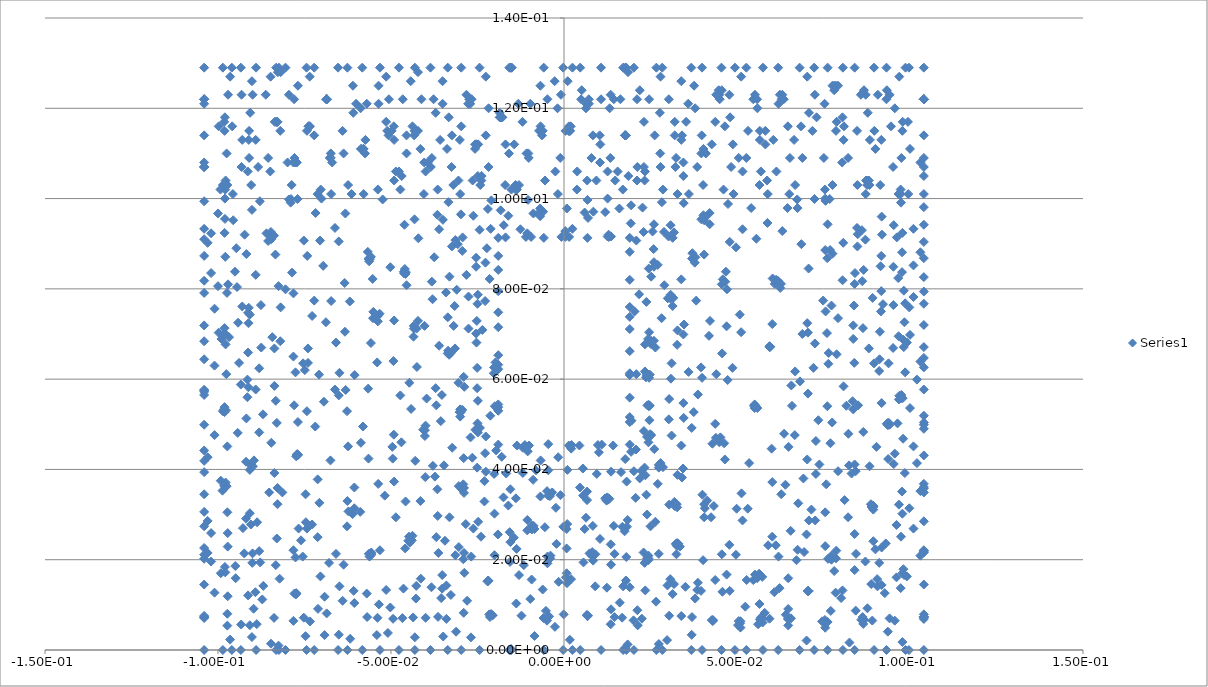
| Category | Series 0 |
|---|---|
| -0.104 | 0.007 |
| -0.0986 | 0 |
| -0.104 | 0 |
| -0.0583 | 0 |
| -0.0541 | 0.003 |
| -0.0532 | 0 |
| -0.0825 | 0.001 |
| -0.0805 | 0 |
| -0.0824 | 0 |
| -0.0832 | 0 |
| -0.104 | 0.008 |
| -0.101 | 0.013 |
| -0.104 | 0.014 |
| -0.0973 | 0.008 |
| -0.104 | 0.007 |
| -0.104 | 0.007 |
| -0.0934 | 0 |
| -0.0965 | 0.002 |
| -0.096 | 0 |
| -0.104 | 0.034 |
| -0.0982 | 0.036 |
| -0.0987 | 0.035 |
| -0.104 | 0.031 |
| -0.0477 | 0 |
| -0.0509 | 0.004 |
| -0.0626 | 0 |
| -0.0618 | 0.002 |
| -0.0569 | 0.007 |
| -0.0744 | 0 |
| -0.0722 | 0 |
| -0.0747 | 0.003 |
| -0.0782 | 0.006 |
| -0.104 | 0.023 |
| -0.104 | 0.027 |
| -0.102 | 0.026 |
| -0.0838 | 0.007 |
| -0.0992 | 0.017 |
| -0.098 | 0.018 |
| -0.102 | 0.02 |
| -0.104 | 0.02 |
| -0.104 | 0.021 |
| -0.103 | 0.029 |
| -0.0979 | 0.036 |
| -0.0979 | 0.036 |
| -0.0973 | 0.03 |
| -0.0653 | 0 |
| -0.0692 | 0.003 |
| -0.0734 | 0.006 |
| -0.0888 | 0.006 |
| -0.0847 | 0.001 |
| -0.0902 | 0.003 |
| -0.089 | 0 |
| -0.0933 | 0.006 |
| -0.0973 | 0.005 |
| -0.0467 | 0.007 |
| -0.0494 | 0.007 |
| -0.0539 | 0.007 |
| -0.0752 | 0.007 |
| -0.0908 | 0.005 |
| -0.0979 | 0.017 |
| -0.0972 | 0.023 |
| -0.0972 | 0.026 |
| -0.103 | 0.022 |
| -0.0711 | 0.009 |
| -0.0686 | 0.008 |
| -0.0651 | 0.003 |
| -0.0975 | 0.036 |
| -0.0913 | 0.012 |
| -0.0892 | 0.013 |
| -0.0897 | 0.009 |
| -0.0949 | 0.016 |
| -0.0872 | 0.011 |
| -0.0972 | 0.012 |
| -0.0535 | 0.01 |
| -0.0502 | 0.009 |
| -0.0514 | 0.013 |
| -0.0919 | 0.029 |
| -0.0928 | 0.027 |
| -0.0908 | 0.04 |
| -0.0908 | 0.03 |
| -0.0692 | 0.012 |
| -0.0869 | 0.014 |
| -0.0901 | 0.019 |
| -0.0878 | 0.019 |
| -0.095 | 0.019 |
| -0.0924 | 0.021 |
| -0.0852 | 0.035 |
| -0.0606 | 0.01 |
| -0.064 | 0.011 |
| -0.0649 | 0.014 |
| -0.0608 | 0.013 |
| -0.0704 | 0.016 |
| -0.0775 | 0.012 |
| -0.0774 | 0.012 |
| -0.0776 | 0.012 |
| -0.0774 | 0.013 |
| -0.0776 | 0.012 |
| -0.0779 | 0.012 |
| -0.0822 | 0.016 |
| -0.0887 | 0.028 |
| -0.0828 | 0.032 |
| -0.083 | 0.025 |
| -0.0881 | 0.022 |
| -0.0559 | 0.021 |
| -0.0557 | 0.021 |
| -0.0562 | 0.021 |
| -0.057 | 0.012 |
| -0.0828 | 0.036 |
| -0.0767 | 0.027 |
| -0.0755 | 0.021 |
| -0.0782 | 0.022 |
| -0.076 | 0.024 |
| -0.0776 | 0.02 |
| -0.0833 | 0.019 |
| -0.09 | 0.021 |
| -0.0905 | 0.028 |
| -0.0459 | 0.022 |
| -0.045 | 0.024 |
| -0.0532 | 0.022 |
| -0.0558 | 0.021 |
| -0.0564 | 0.021 |
| -0.0679 | 0.019 |
| -0.0712 | 0.025 |
| -0.0659 | 0.021 |
| -0.0637 | 0.019 |
| -0.0814 | 0.035 |
| -0.0746 | 0.028 |
| -0.0627 | 0.027 |
| -0.0559 | 0.021 |
| -0.0611 | 0.03 |
| -0.0448 | 0.025 |
| -0.0557 | 0.022 |
| -0.0589 | 0.031 |
| -0.0486 | 0.029 |
| -0.0747 | 0.034 |
| -0.0728 | 0.028 |
| -0.0743 | 0.027 |
| -0.0623 | 0.031 |
| -0.0707 | 0.033 |
| -0.0518 | 0.034 |
| -0.0537 | 0.037 |
| -0.0606 | 0.031 |
| -0.0626 | 0.033 |
| -0.0712 | 0.038 |
| -0.0606 | 0.036 |
| -0.0565 | 0.042 |
| -0.0624 | 0.045 |
| -0.0675 | 0.042 |
| -0.0431 | 0 |
| -0.0431 | 0.003 |
| -0.0491 | 0.037 |
| -0.0349 | 0.003 |
| -0.0336 | 0 |
| -0.0386 | 0 |
| -0.00586 | 0 |
| -0.00492 | 0.006 |
| -0.00262 | 0.005 |
| -0.000234 | 0 |
| -0.0043 | 0.007 |
| -0.0364 | 0.007 |
| -0.034 | 0.007 |
| -0.0269 | 0.003 |
| -0.0297 | 0 |
| -0.0244 | 0 |
| -0.0158 | 0 |
| -0.0155 | 0 |
| -0.0155 | 0 |
| -0.0214 | 0.007 |
| -0.0212 | 0.008 |
| -0.04 | 0.007 |
| 0.00169 | 0.002 |
| 0.00243 | 0 |
| -0.0153 | 0 |
| -0.0206 | 0.008 |
| -0.0152 | 0 |
| -0.00593 | 0.007 |
| -0.00853 | 0.003 |
| -0.0123 | 0.008 |
| -0.0216 | 0.008 |
| -0.029 | 0.008 |
| -0.0312 | 0.004 |
| -0.00523 | 0.009 |
| -0.00975 | 0.011 |
| -0.0464 | 0.014 |
| -0.0428 | 0.011 |
| -0.0427 | 0.014 |
| -0.0138 | 0.01 |
| -0.021 | 0.008 |
| -0.0355 | 0.012 |
| -0.0352 | 0.014 |
| -0.0327 | 0.012 |
| -0.0383 | 0.014 |
| -0.0436 | 0.007 |
| -0.0219 | 0.015 |
| -0.028 | 0.011 |
| -0.0221 | 0.015 |
| -0.0414 | 0.016 |
| 0.00664 | 0.008 |
| 0.000863 | 0.015 |
| -0.0001 | 0.008 |
| 0.00673 | 0.008 |
| 0.00205 | 0.016 |
| -0.00155 | 0.015 |
| -0.00615 | 0.013 |
| -0.00935 | 0.016 |
| -0.013 | 0.017 |
| -0.0116 | 0.019 |
| -0.00489 | 0.035 |
| -0.00456 | 0.034 |
| -0.00406 | 0.034 |
| -0.00341 | 0.035 |
| -0.00102 | 0.034 |
| -0.034 | 0.014 |
| -0.022 | 0.015 |
| -0.022 | 0.015 |
| -0.0212 | 0.008 |
| -0.0288 | 0.017 |
| -0.0291 | 0.02 |
| -0.0219 | 0.015 |
| -0.0268 | 0.021 |
| -0.0156 | 0.02 |
| -0.0139 | 0.034 |
| -0.0106 | 0.029 |
| -0.00681 | 0.034 |
| -0.00929 | 0.028 |
| -0.0088 | 0.028 |
| -0.00478 | 0.021 |
| -0.00391 | 0.021 |
| -0.00853 | 0.027 |
| -0.00925 | 0.027 |
| -0.00479 | 0.019 |
| -0.0201 | 0.021 |
| -0.044 | 0.024 |
| -0.0445 | 0.024 |
| -0.00919 | 0.027 |
| 0.000765 | 0.022 |
| -0.00217 | 0.024 |
| 0.00078 | 0.017 |
| -0.00552 | 0.027 |
| -0.00235 | 0.032 |
| 0.00552 | 0.034 |
| 0.000933 | 0.028 |
| 0.00563 | 0.019 |
| -0.0314 | 0.021 |
| -0.0352 | 0.017 |
| -0.0363 | 0.022 |
| -0.0344 | 0.024 |
| -0.023 | 0.037 |
| -0.023 | 0.033 |
| -0.0175 | 0.034 |
| -0.00021 | 0.027 |
| -0.0137 | 0.022 |
| -0.0155 | 0.024 |
| -0.0106 | 0.026 |
| -0.0145 | 0.025 |
| -0.0289 | 0.036 |
| -0.0438 | 0.025 |
| -0.0369 | 0.025 |
| -0.0289 | 0.035 |
| -0.0248 | 0.028 |
| -0.0295 | 0.036 |
| -0.0294 | 0.036 |
| -0.024 | 0.025 |
| -0.0262 | 0.027 |
| -0.0289 | 0.022 |
| 0.000772 | 0.027 |
| -0.0201 | 0.03 |
| -0.0157 | 0.026 |
| -0.0191 | 0.026 |
| -0.0161 | 0.032 |
| -0.0155 | 0.036 |
| -0.0304 | 0.036 |
| -0.0373 | 0.038 |
| -0.0366 | 0.036 |
| -0.0331 | 0.029 |
| -0.0365 | 0.03 |
| -0.0304 | 0.023 |
| -0.0284 | 0.028 |
| -0.0401 | 0.038 |
| -0.0458 | 0.033 |
| -0.0415 | 0.033 |
| 0.000547 | 0.016 |
| -0.00399 | 0.02 |
| -0.019 | 0.046 |
| -0.018 | 0.043 |
| -0.0136 | 0.045 |
| -0.0113 | 0.045 |
| -0.0101 | 0.045 |
| -0.0105 | 0.044 |
| -0.0119 | 0.039 |
| -0.00808 | 0.04 |
| -0.00675 | 0.042 |
| -0.00455 | 0.046 |
| -0.019 | 0.065 |
| -0.0198 | 0.064 |
| -0.019 | 0.063 |
| -0.02 | 0.054 |
| -0.019 | 0.054 |
| -0.019 | 0.054 |
| -0.019 | 0.062 |
| -0.0203 | 0.061 |
| -0.0249 | 0.055 |
| -0.00453 | 0.04 |
| 0.00209 | 0.045 |
| 0.00221 | 0.045 |
| 0.00139 | 0.045 |
| -0.00168 | 0.043 |
| -0.0167 | 0.039 |
| -0.0119 | 0.045 |
| -0.0202 | 0.063 |
| -0.0251 | 0.058 |
| -0.0251 | 0.062 |
| -0.0226 | 0.047 |
| -0.0213 | 0.052 |
| -0.019 | 0.053 |
| -0.025 | 0.05 |
| -0.0243 | 0.049 |
| -0.0236 | 0.071 |
| -0.0254 | 0.07 |
| -0.0253 | 0.068 |
| -0.019 | 0.072 |
| -0.00892 | 0.038 |
| -0.0196 | 0.044 |
| -0.0249 | 0.048 |
| 0.000984 | 0.04 |
| -0.0294 | 0.053 |
| -0.0202 | 0.039 |
| -0.0226 | 0.04 |
| -0.0298 | 0.053 |
| -0.03 | 0.053 |
| -0.0256 | 0.049 |
| -0.0327 | 0.066 |
| -0.0332 | 0.065 |
| -0.0332 | 0.066 |
| -0.0315 | 0.067 |
| 0.0046 | 0.036 |
| -0.027 | 0.047 |
| -0.03 | 0.052 |
| -0.0323 | 0.045 |
| -0.0336 | 0.066 |
| -0.0335 | 0.066 |
| -0.0361 | 0.067 |
| -0.0302 | 0.053 |
| -0.0353 | 0.056 |
| -0.0369 | 0.054 |
| -0.029 | 0.042 |
| -0.0291 | 0.037 |
| -0.0251 | 0.04 |
| -0.0265 | 0.043 |
| -0.0228 | 0.044 |
| -0.0426 | 0.071 |
| -0.0435 | 0.069 |
| -0.0425 | 0.063 |
| -0.0371 | 0.058 |
| -0.0347 | 0.041 |
| -0.0379 | 0.041 |
| -0.0305 | 0.059 |
| -0.029 | 0.06 |
| -0.0288 | 0.058 |
| -0.0397 | 0.056 |
| -0.0447 | 0.059 |
| -0.0442 | 0.053 |
| -0.0434 | 0.071 |
| -0.0493 | 0.064 |
| -0.0473 | 0.056 |
| -0.054 | 0.064 |
| -0.047 | 0.046 |
| -0.0492 | 0.048 |
| -0.043 | 0.042 |
| -0.0495 | 0.042 |
| -0.0496 | 0.045 |
| -0.0587 | 0.046 |
| -0.0581 | 0.05 |
| -0.0566 | 0.058 |
| -0.0491 | 0.073 |
| -0.0538 | 0.073 |
| -0.0402 | 0.049 |
| -0.04 | 0.05 |
| -0.0407 | 0.049 |
| -0.0402 | 0.047 |
| -0.0356 | 0.051 |
| -0.104 | 0.05 |
| -0.101 | 0.048 |
| -0.104 | 0.044 |
| -0.104 | 0.042 |
| -0.0992 | 0.038 |
| -0.104 | 0.039 |
| -0.0978 | 0.037 |
| -0.104 | 0.057 |
| -0.104 | 0.056 |
| -0.0986 | 0.053 |
| -0.0983 | 0.053 |
| -0.0981 | 0.053 |
| -0.0973 | 0.045 |
| -0.103 | 0.043 |
| -0.099 | 0.069 |
| -0.0998 | 0.07 |
| -0.104 | 0.068 |
| -0.104 | 0.064 |
| -0.098 | 0.07 |
| -0.0981 | 0.053 |
| -0.104 | 0.058 |
| -0.0976 | 0.061 |
| -0.0981 | 0.054 |
| -0.0978 | 0.068 |
| -0.101 | 0.063 |
| -0.104 | 0.058 |
| -0.0919 | 0.042 |
| -0.0939 | 0.064 |
| -0.0977 | 0.053 |
| -0.0943 | 0.048 |
| -0.0907 | 0.041 |
| -0.0915 | 0.056 |
| -0.0934 | 0.059 |
| -0.0912 | 0.058 |
| -0.0918 | 0.051 |
| -0.0875 | 0.067 |
| -0.0843 | 0.069 |
| -0.0837 | 0.067 |
| -0.0915 | 0.06 |
| -0.0913 | 0.066 |
| -0.0968 | 0.069 |
| -0.0891 | 0.058 |
| -0.0837 | 0.058 |
| -0.0881 | 0.062 |
| -0.0899 | 0.041 |
| -0.0896 | 0.042 |
| -0.0837 | 0.039 |
| -0.0846 | 0.046 |
| -0.0881 | 0.048 |
| -0.0782 | 0.065 |
| -0.074 | 0.067 |
| -0.0728 | 0.074 |
| -0.082 | 0.068 |
| -0.0754 | 0.064 |
| -0.0776 | 0.062 |
| -0.078 | 0.054 |
| -0.0749 | 0.062 |
| -0.0743 | 0.053 |
| -0.0769 | 0.05 |
| -0.0833 | 0.055 |
| -0.083 | 0.05 |
| -0.087 | 0.052 |
| -0.074 | 0.064 |
| -0.0774 | 0.043 |
| -0.0772 | 0.043 |
| -0.077 | 0.043 |
| -0.0771 | 0.043 |
| -0.0771 | 0.043 |
| -0.0688 | 0.073 |
| -0.0659 | 0.068 |
| -0.0769 | 0.043 |
| -0.0719 | 0.05 |
| -0.0708 | 0.061 |
| -0.0694 | 0.055 |
| -0.0649 | 0.061 |
| -0.0662 | 0.058 |
| -0.0605 | 0.061 |
| -0.0558 | 0.068 |
| -0.0633 | 0.07 |
| -0.0651 | 0.056 |
| -0.0627 | 0.053 |
| -0.0631 | 0.058 |
| 0.0124 | 0.014 |
| 0.00902 | 0.014 |
| 0.00842 | 0.02 |
| 0.0136 | 0.019 |
| 0.00906 | 0.021 |
| 0.0146 | 0.021 |
| 0.0171 | 0.014 |
| 0.0179 | 0.015 |
| 0.019 | 0.014 |
| 0.00682 | 0.008 |
| 0.0136 | 0.009 |
| 0.0161 | 0.01 |
| 0.0325 | 0.021 |
| 0.0326 | 0.023 |
| 0.0274 | 0.021 |
| 0.008 | 0.021 |
| 0.00738 | 0.021 |
| 0.0244 | 0.02 |
| 0.0244 | 0.02 |
| 0.024 | 0.02 |
| 0.0233 | 0.019 |
| 0.018 | 0.021 |
| 0.0307 | 0.016 |
| 0.0299 | 0.014 |
| 0.0318 | 0.015 |
| 0.00677 | 0.008 |
| 0.00679 | 0.008 |
| 0.0235 | 0.013 |
| 0.0146 | 0.007 |
| 0.0168 | 0.007 |
| 0.0212 | 0.009 |
| 0.0314 | 0.012 |
| 0.0225 | 0.007 |
| 0.0266 | 0.011 |
| 0.0201 | 0.007 |
| 0.0304 | 0.008 |
| 0.00683 | 0.008 |
| 0.0184 | 0.001 |
| 0.0213 | 0.005 |
| 0.0171 | 0 |
| 0.0135 | 0.006 |
| 0.0177 | 0 |
| 0.018 | 0 |
| 0.00681 | 0.008 |
| 0.00469 | 0 |
| 0.0107 | 0 |
| 0.0284 | 0 |
| 0.0267 | 0 |
| 0.0274 | 0.001 |
| 0.0202 | 0 |
| 0.0524 | 0.01 |
| 0.0547 | 0.016 |
| 0.0565 | 0.01 |
| 0.0558 | 0.016 |
| 0.0528 | 0.016 |
| 0.0552 | 0.017 |
| 0.0399 | 0 |
| 0.043 | 0.006 |
| 0.0427 | 0.007 |
| 0.0369 | 0.003 |
| 0.0368 | 0 |
| 0.043 | 0.007 |
| 0.0335 | 0.023 |
| 0.0479 | 0.013 |
| 0.047 | 0.017 |
| 0.0458 | 0.013 |
| 0.0456 | 0.021 |
| 0.0497 | 0.021 |
| 0.0437 | 0.016 |
| 0.0402 | 0.02 |
| 0.0351 | 0.014 |
| 0.0387 | 0.015 |
| 0.0396 | 0.013 |
| 0.0385 | 0.013 |
| 0.0569 | 0.007 |
| 0.051 | 0.006 |
| 0.0379 | 0.011 |
| 0.0339 | 0.008 |
| 0.0509 | 0.006 |
| 0.0505 | 0.006 |
| 0.0566 | 0.007 |
| 0.0573 | 0.007 |
| 0.037 | 0.007 |
| 0.0431 | 0.007 |
| 0.0298 | 0.002 |
| 0.0574 | 0.006 |
| 0.0561 | 0.006 |
| 0.051 | 0.005 |
| 0.0527 | 0 |
| 0.0575 | 0 |
| 0.0503 | 0.006 |
| 0.0455 | 0 |
| 0.0494 | 0 |
| 0.0328 | 0.039 |
| 0.0271 | 0.037 |
| 0.0319 | 0.033 |
| 0.032 | 0.032 |
| 0.0304 | 0.032 |
| 0.0238 | 0.034 |
| 0.0323 | 0.024 |
| 0.025 | 0.027 |
| 0.0244 | 0.021 |
| 0.0465 | 0.042 |
| 0.0513 | 0.035 |
| 0.0535 | 0.041 |
| 0.0463 | 0.046 |
| 0.0449 | 0.046 |
| 0.0602 | 0.037 |
| 0.0602 | 0.025 |
| 0.0531 | 0.031 |
| 0.0628 | 0.034 |
| 0.04 | 0.034 |
| 0.0414 | 0.033 |
| 0.0405 | 0.032 |
| 0.0429 | 0.046 |
| 0.0341 | 0.038 |
| 0.0344 | 0.04 |
| 0.0331 | 0.024 |
| 0.0407 | 0.031 |
| 0.0405 | 0.029 |
| 0.0425 | 0.029 |
| 0.0433 | 0.032 |
| 0.0478 | 0.023 |
| 0.0499 | 0.031 |
| 0.0326 | 0.032 |
| 0.0327 | 0.032 |
| 0.0264 | 0.028 |
| 0.024 | 0.03 |
| 0.0327 | 0.024 |
| 0.059 | 0.023 |
| 0.0516 | 0.029 |
| 0.0207 | 0.034 |
| 0.00833 | 0.028 |
| 0.0104 | 0.025 |
| 0.0144 | 0.028 |
| 0.0135 | 0.023 |
| 0.0169 | 0.027 |
| 0.00597 | 0.027 |
| 0.00636 | 0.029 |
| 0.00668 | 0.033 |
| 0.00816 | 0.022 |
| 0.0123 | 0.033 |
| 0.0127 | 0.033 |
| 0.0119 | 0.034 |
| 0.0127 | 0.034 |
| 0.023 | 0.022 |
| 0.0182 | 0.027 |
| 0.0184 | 0.029 |
| 0.0175 | 0.026 |
| 0.0131 | 0.034 |
| 0.0786 | 0.02 |
| 0.0773 | 0.02 |
| 0.0773 | 0.021 |
| 0.0763 | 0.02 |
| 0.0781 | 0.018 |
| 0.0706 | 0.013 |
| 0.0706 | 0.013 |
| 0.0706 | 0.013 |
| 0.0754 | 0.006 |
| 0.0754 | 0.007 |
| 0.0746 | 0.006 |
| 0.0762 | 0.006 |
| 0.0706 | 0.013 |
| 0.0706 | 0.013 |
| 0.0648 | 0.016 |
| 0.0672 | 0.02 |
| 0.062 | 0.021 |
| 0.0612 | 0.023 |
| 0.0675 | 0.022 |
| 0.0694 | 0.022 |
| 0.0647 | 0.007 |
| 0.0648 | 0.009 |
| 0.0641 | 0.008 |
| 0.0656 | 0.007 |
| 0.0623 | 0.014 |
| 0.0706 | 0.013 |
| 0.0706 | 0.013 |
| 0.0608 | 0.013 |
| 0.0573 | 0.016 |
| 0.0564 | 0.017 |
| 0.084 | 0.018 |
| 0.0844 | 0.021 |
| 0.0805 | 0.013 |
| 0.0785 | 0.013 |
| 0.0801 | 0.012 |
| 0.0771 | 0.009 |
| 0.0706 | 0.013 |
| 0.058 | 0.008 |
| 0.0594 | 0.007 |
| 0.0843 | 0.009 |
| 0.0859 | 0.007 |
| 0.0755 | 0.005 |
| 0.0648 | 0.005 |
| 0.0619 | 0 |
| 0.084 | 0 |
| 0.0825 | 0.002 |
| 0.0806 | 0 |
| 0.0681 | 0 |
| 0.0701 | 0.002 |
| 0.0762 | 0 |
| 0.0723 | 0 |
| 0.0891 | 0.007 |
| 0.0877 | 0.009 |
| 0.0868 | 0.007 |
| 0.0863 | 0.007 |
| 0.0936 | 0.004 |
| 0.0941 | 0.007 |
| 0.0956 | 0.006 |
| 0.0871 | 0.02 |
| 0.0961 | 0.016 |
| 0.0911 | 0.019 |
| 0.0918 | 0.023 |
| 0.0978 | 0.017 |
| 0.0983 | 0.017 |
| 0.09 | 0.022 |
| 0.0905 | 0.016 |
| 0.0888 | 0.015 |
| 0.0906 | 0.014 |
| 0.0918 | 0.014 |
| 0.0973 | 0.014 |
| 0.0927 | 0.013 |
| 0.104 | 0.007 |
| 0.104 | 0.007 |
| 0.104 | 0.008 |
| 0.104 | 0.007 |
| 0.104 | 0.007 |
| 0.104 | 0.007 |
| 0.0978 | 0.002 |
| 0.0865 | 0.006 |
| 0.0896 | 0 |
| 0.0991 | 0.016 |
| 0.104 | 0.014 |
| 0.103 | 0.021 |
| 0.104 | 0.022 |
| 0.104 | 0.022 |
| 0.0997 | 0 |
| 0.0987 | 0 |
| 0.0932 | 0 |
| 0.104 | 0 |
| 0.0811 | 0.033 |
| 0.0821 | 0.029 |
| 0.0755 | 0.03 |
| 0.0977 | 0.035 |
| 0.0968 | 0.032 |
| 0.0893 | 0.032 |
| 0.0894 | 0.032 |
| 0.0953 | 0.041 |
| 0.0892 | 0.032 |
| 0.0893 | 0.032 |
| 0.0758 | 0.037 |
| 0.0831 | 0.039 |
| 0.0792 | 0.04 |
| 0.0728 | 0.039 |
| 0.0715 | 0.031 |
| 0.0894 | 0.024 |
| 0.0894 | 0.031 |
| 0.0787 | 0.022 |
| 0.084 | 0.026 |
| 0.0755 | 0.023 |
| 0.0891 | 0.032 |
| 0.0889 | 0.032 |
| 0.0726 | 0.029 |
| 0.0887 | 0.032 |
| 0.0843 | 0.04 |
| 0.0892 | 0.032 |
| 0.0937 | 0.042 |
| 0.0883 | 0.041 |
| 0.093 | 0.024 |
| 0.0981 | 0.018 |
| 0.0961 | 0.028 |
| 0.0974 | 0.025 |
| 0.103 | 0.035 |
| 0.0998 | 0.031 |
| 0.0978 | 0.03 |
| 0.104 | 0.022 |
| 0.101 | 0.027 |
| 0.104 | 0.022 |
| 0.104 | 0.028 |
| 0.104 | 0.035 |
| 0.104 | 0.036 |
| 0.064 | 0.037 |
| 0.0677 | 0.032 |
| 0.0692 | 0.038 |
| 0.0655 | 0.026 |
| 0.0701 | 0.026 |
| 0.0708 | 0.029 |
| 0.0667 | 0.048 |
| 0.0649 | 0.045 |
| 0.0703 | 0.042 |
| 0.06 | 0.045 |
| 0.0636 | 0.048 |
| 0.0659 | 0.054 |
| 0.0559 | 0.054 |
| 0.0738 | 0.041 |
| 0.0549 | 0.054 |
| 0.0551 | 0.054 |
| 0.0553 | 0.054 |
| 0.0452 | 0.047 |
| 0.0735 | 0.051 |
| 0.0728 | 0.046 |
| 0.0705 | 0.057 |
| 0.0682 | 0.06 |
| 0.0657 | 0.059 |
| 0.0824 | 0.041 |
| 0.077 | 0.046 |
| 0.0775 | 0.05 |
| 0.0761 | 0.054 |
| 0.0822 | 0.048 |
| 0.0473 | 0.06 |
| 0.0816 | 0.054 |
| 0.0836 | 0.053 |
| 0.0964 | 0.05 |
| 0.0941 | 0.05 |
| 0.0939 | 0.05 |
| 0.104 | 0.05 |
| 0.1 | 0.054 |
| 0.098 | 0.047 |
| 0.0865 | 0.048 |
| 0.0933 | 0.05 |
| 0.0936 | 0.05 |
| 0.0936 | 0.05 |
| 0.0903 | 0.045 |
| 0.0956 | 0.044 |
| 0.0985 | 0.039 |
| 0.104 | 0.036 |
| 0.102 | 0.041 |
| 0.104 | 0.037 |
| 0.101 | 0.045 |
| 0.104 | 0.043 |
| 0.084 | 0.041 |
| 0.104 | 0.05 |
| 0.104 | 0.049 |
| 0.0973 | 0.056 |
| 0.085 | 0.054 |
| 0.0918 | 0.055 |
| 0.0968 | 0.056 |
| 0.0969 | 0.056 |
| 0.0975 | 0.056 |
| 0.0788 | 0.066 |
| 0.0765 | 0.066 |
| 0.0764 | 0.063 |
| 0.0808 | 0.058 |
| 0.0834 | 0.055 |
| 0.0839 | 0.064 |
| 0.0836 | 0.069 |
| 0.0864 | 0.071 |
| 0.0881 | 0.067 |
| 0.0913 | 0.07 |
| 0.0916 | 0.075 |
| 0.0912 | 0.064 |
| 0.0896 | 0.064 |
| 0.0911 | 0.062 |
| 0.0938 | 0.064 |
| 0.0986 | 0.062 |
| 0.0981 | 0.069 |
| 0.0951 | 0.067 |
| 0.0982 | 0.067 |
| 0.0967 | 0.07 |
| 0.104 | 0.052 |
| 0.0979 | 0.056 |
| 0.104 | 0.058 |
| 0.102 | 0.06 |
| 0.104 | 0.063 |
| 0.103 | 0.064 |
| 0.0991 | 0.068 |
| 0.104 | 0.065 |
| 0.0668 | 0.062 |
| 0.0595 | 0.067 |
| 0.0596 | 0.067 |
| 0.0594 | 0.067 |
| 0.0487 | 0.062 |
| 0.0512 | 0.07 |
| 0.0551 | 0.054 |
| 0.0689 | 0.07 |
| 0.0725 | 0.068 |
| 0.0721 | 0.062 |
| 0.044 | 0.061 |
| 0.0457 | 0.066 |
| 0.047 | 0.072 |
| 0.0248 | 0.047 |
| 0.0261 | 0.044 |
| 0.0244 | 0.046 |
| 0.0252 | 0.048 |
| 0.0274 | 0.04 |
| 0.0235 | 0.039 |
| 0.0274 | 0.041 |
| 0.0233 | 0.04 |
| 0.0279 | 0.041 |
| 0.0311 | 0.048 |
| 0.0286 | 0.04 |
| 0.00446 | 0.045 |
| 0.0101 | 0.044 |
| 0.00546 | 0.04 |
| 0.00947 | 0.039 |
| 0.0231 | 0.048 |
| 0.0247 | 0.051 |
| 0.0249 | 0.048 |
| 0.0208 | 0.044 |
| 0.019 | 0.046 |
| 0.0194 | 0.044 |
| 0.024 | 0.047 |
| 0.0224 | 0.04 |
| 0.0219 | 0.038 |
| 0.0181 | 0.037 |
| 0.0202 | 0.04 |
| 0.0165 | 0.039 |
| 0.0128 | 0.034 |
| 0.0303 | 0.051 |
| 0.00668 | 0.035 |
| 0.0125 | 0.034 |
| 0.0136 | 0.04 |
| 0.0177 | 0.042 |
| 0.0248 | 0.054 |
| 0.0245 | 0.054 |
| 0.019 | 0.05 |
| 0.019 | 0.052 |
| 0.0195 | 0.051 |
| 0.0142 | 0.045 |
| 0.0109 | 0.046 |
| 0.0098 | 0.045 |
| 0.0339 | 0.045 |
| 0.0439 | 0.047 |
| 0.0437 | 0.05 |
| 0.0387 | 0.057 |
| 0.0375 | 0.053 |
| 0.0369 | 0.049 |
| 0.0346 | 0.051 |
| 0.036 | 0.062 |
| 0.0399 | 0.06 |
| 0.0396 | 0.063 |
| 0.0419 | 0.07 |
| 0.0345 | 0.07 |
| 0.0327 | 0.068 |
| 0.0328 | 0.071 |
| 0.0345 | 0.055 |
| 0.0304 | 0.056 |
| 0.0309 | 0.06 |
| 0.0264 | 0.067 |
| 0.026 | 0.068 |
| 0.0311 | 0.064 |
| 0.0248 | 0.061 |
| 0.0251 | 0.068 |
| 0.0242 | 0.061 |
| 0.0242 | 0.061 |
| 0.0246 | 0.06 |
| 0.0245 | 0.054 |
| 0.019 | 0.061 |
| 0.019 | 0.061 |
| 0.0209 | 0.061 |
| 0.019 | 0.056 |
| 0.0237 | 0.06 |
| 0.0241 | 0.054 |
| 0.0239 | 0.061 |
| 0.019 | 0.066 |
| 0.0234 | 0.062 |
| 0.0234 | 0.068 |
| 0.0252 | 0.068 |
| 0.0282 | 0.074 |
| 0.0246 | 0.07 |
| 0.0314 | 0.076 |
| 0.026 | 0.085 |
| 0.029 | 0.081 |
| 0.0271 | 0.085 |
| 0.03 | 0.078 |
| 0.0307 | 0.078 |
| 0.0308 | 0.079 |
| 0.0238 | 0.077 |
| 0.0252 | 0.083 |
| 0.0204 | 0.075 |
| 0.0217 | 0.079 |
| 0.019 | 0.076 |
| 0.019 | 0.082 |
| 0.0243 | 0.069 |
| 0.019 | 0.074 |
| 0.0245 | 0.084 |
| 0.019 | 0.071 |
| 0.0471 | 0.08 |
| 0.0466 | 0.082 |
| 0.0614 | 0.082 |
| 0.0609 | 0.081 |
| 0.0339 | 0.082 |
| 0.037 | 0.087 |
| 0.0602 | 0.072 |
| 0.0617 | 0.081 |
| 0.0616 | 0.082 |
| 0.0508 | 0.074 |
| 0.0594 | 0.067 |
| 0.0456 | 0.081 |
| 0.0459 | 0.082 |
| 0.0422 | 0.073 |
| 0.0382 | 0.077 |
| 0.0378 | 0.086 |
| 0.038 | 0.087 |
| 0.0347 | 0.072 |
| 0.0316 | 0.078 |
| 0.0209 | 0.091 |
| 0.026 | 0.086 |
| 0.019 | 0.088 |
| 0.0516 | 0.093 |
| 0.0479 | 0.09 |
| 0.0497 | 0.089 |
| 0.0556 | 0.091 |
| 0.0588 | 0.095 |
| 0.0541 | 0.098 |
| 0.0565 | 0.103 |
| 0.049 | 0.101 |
| 0.0289 | 0.093 |
| 0.0302 | 0.092 |
| 0.0318 | 0.092 |
| 0.0314 | 0.091 |
| 0.0259 | 0.089 |
| 0.023 | 0.093 |
| 0.0603 | 0.082 |
| 0.0468 | 0.084 |
| 0.0405 | 0.095 |
| 0.0421 | 0.094 |
| 0.0407 | 0.096 |
| 0.0421 | 0.097 |
| 0.0403 | 0.096 |
| 0.0397 | 0.095 |
| 0.0193 | 0.094 |
| 0.026 | 0.094 |
| 0.0227 | 0.098 |
| 0.0194 | 0.098 |
| 0.0613 | 0.082 |
| 0.0474 | 0.099 |
| 0.0405 | 0.088 |
| 0.0346 | 0.099 |
| 0.0371 | 0.088 |
| 0.0361 | 0.101 |
| 0.0461 | 0.102 |
| 0.0402 | 0.103 |
| 0.0328 | 0.101 |
| 0.0308 | 0.094 |
| 0.0283 | 0.099 |
| 0.0256 | 0.093 |
| 0.019 | 0.091 |
| -0.0069 | 0.098 |
| -0.00688 | 0.097 |
| -0.00604 | 0.097 |
| 0.016 | 0.098 |
| 0.0126 | 0.1 |
| 0.0119 | 0.097 |
| 0.00848 | 0.097 |
| 0.00694 | 0.096 |
| 0.00243 | 0.093 |
| 0.00596 | 0.097 |
| 0.00677 | 0.091 |
| 0.00148 | 0.092 |
| 0.000379 | 0.093 |
| 0.000827 | 0.098 |
| 0.0129 | 0.092 |
| 0.0126 | 0.092 |
| 0.000375 | 0.092 |
| -0.00075 | 0.092 |
| -0.00689 | 0.096 |
| 0.0136 | 0.092 |
| -0.00583 | 0.091 |
| 0.0129 | 0.092 |
| 0.0618 | 0.082 |
| 0.0627 | 0.081 |
| 0.0625 | 0.08 |
| 0.0756 | 0.075 |
| 0.0705 | 0.07 |
| 0.0703 | 0.072 |
| 0.0749 | 0.077 |
| 0.076 | 0.07 |
| 0.0707 | 0.084 |
| 0.084 | 0.081 |
| 0.0841 | 0.084 |
| 0.0805 | 0.082 |
| 0.0773 | 0.076 |
| 0.0761 | 0.087 |
| 0.0792 | 0.074 |
| 0.0836 | 0.072 |
| 0.0838 | 0.076 |
| 0.0966 | 0.082 |
| 0.0922 | 0.077 |
| 0.0917 | 0.08 |
| 0.0952 | 0.085 |
| 0.0977 | 0.084 |
| 0.0892 | 0.078 |
| 0.0952 | 0.076 |
| 0.0982 | 0.08 |
| 0.0915 | 0.085 |
| 0.0917 | 0.087 |
| 0.0862 | 0.082 |
| 0.0866 | 0.084 |
| 0.0986 | 0.077 |
| 0.0984 | 0.073 |
| 0.1 | 0.07 |
| 0.101 | 0.085 |
| 0.104 | 0.083 |
| 0.101 | 0.078 |
| 0.104 | 0.079 |
| 0.0998 | 0.076 |
| 0.104 | 0.072 |
| 0.104 | 0.077 |
| 0.104 | 0.067 |
| 0.104 | 0.087 |
| 0.0807 | 0.09 |
| 0.0769 | 0.089 |
| 0.0776 | 0.088 |
| 0.0762 | 0.094 |
| 0.0872 | 0.101 |
| 0.0848 | 0.103 |
| 0.0876 | 0.103 |
| 0.0768 | 0.1 |
| 0.0847 | 0.094 |
| 0.0861 | 0.093 |
| 0.0883 | 0.103 |
| 0.0918 | 0.096 |
| 0.0849 | 0.092 |
| 0.0848 | 0.089 |
| 0.0756 | 0.1 |
| 0.0755 | 0.1 |
| 0.0871 | 0.091 |
| 0.0968 | 0.101 |
| 0.0914 | 0.103 |
| 0.0967 | 0.101 |
| 0.0881 | 0.104 |
| 0.0919 | 0.092 |
| 0.0978 | 0.092 |
| 0.0974 | 0.099 |
| 0.0953 | 0.094 |
| 0.0962 | 0.091 |
| 0.0973 | 0.101 |
| 0.0977 | 0.088 |
| 0.0995 | 0.101 |
| 0.104 | 0.09 |
| 0.104 | 0.094 |
| 0.101 | 0.093 |
| 0.104 | 0.098 |
| 0.103 | 0.088 |
| 0.104 | 0.101 |
| 0.0651 | 0.101 |
| 0.0674 | 0.1 |
| 0.0646 | 0.098 |
| 0.0587 | 0.104 |
| 0.0589 | 0.101 |
| 0.0755 | 0.089 |
| 0.0675 | 0.098 |
| 0.0631 | 0.093 |
| 0.0686 | 0.09 |
| 0.0724 | 0.1 |
| 0.0718 | 0.115 |
| 0.0689 | 0.109 |
| 0.0751 | 0.109 |
| 0.0605 | 0.113 |
| 0.0653 | 0.109 |
| 0.0665 | 0.113 |
| 0.0614 | 0.106 |
| 0.0582 | 0.112 |
| 0.0566 | 0.113 |
| 0.0569 | 0.106 |
| 0.0668 | 0.103 |
| 0.0582 | 0.115 |
| 0.0516 | 0.106 |
| 0.0527 | 0.109 |
| 0.0483 | 0.107 |
| 0.0505 | 0.109 |
| 0.0873 | 0.104 |
| 0.0804 | 0.108 |
| 0.0776 | 0.103 |
| 0.0786 | 0.115 |
| 0.0808 | 0.113 |
| 0.0809 | 0.116 |
| 0.0788 | 0.117 |
| 0.0754 | 0.102 |
| 0.0877 | 0.104 |
| 0.0821 | 0.109 |
| 0.0532 | 0.115 |
| 0.0488 | 0.112 |
| 0.0465 | 0.116 |
| 0.073 | 0.118 |
| 0.0685 | 0.116 |
| 0.0566 | 0.115 |
| 0.0647 | 0.116 |
| 0.09 | 0.111 |
| 0.0884 | 0.113 |
| 0.0897 | 0.115 |
| 0.0973 | 0.102 |
| 0.0951 | 0.107 |
| 0.0847 | 0.115 |
| 0.0917 | 0.113 |
| 0.0975 | 0.109 |
| 0.0945 | 0.116 |
| 0.0978 | 0.115 |
| 0.0979 | 0.117 |
| 0.0994 | 0.117 |
| 0.104 | 0.105 |
| 0.103 | 0.108 |
| 0.104 | 0.107 |
| 0.1 | 0.111 |
| 0.104 | 0.114 |
| 0.104 | 0.109 |
| 0.0786 | 0.125 |
| 0.0776 | 0.125 |
| 0.0781 | 0.124 |
| 0.0781 | 0.125 |
| 0.0858 | 0.123 |
| 0.0805 | 0.118 |
| 0.0725 | 0.123 |
| 0.0753 | 0.121 |
| 0.0933 | 0.124 |
| 0.0907 | 0.123 |
| 0.0941 | 0.123 |
| 0.104 | 0.122 |
| 0.104 | 0.122 |
| 0.0956 | 0.12 |
| 0.0969 | 0.127 |
| 0.104 | 0.122 |
| 0.0878 | 0.119 |
| 0.0932 | 0.122 |
| 0.0872 | 0.123 |
| 0.104 | 0.122 |
| 0.104 | 0.122 |
| 0.0723 | 0.129 |
| 0.0703 | 0.127 |
| 0.0762 | 0.129 |
| 0.0792 | 0.125 |
| 0.0806 | 0.129 |
| 0.084 | 0.129 |
| 0.0867 | 0.124 |
| 0.0987 | 0.129 |
| 0.0896 | 0.129 |
| 0.0932 | 0.129 |
| 0.104 | 0.122 |
| 0.104 | 0.129 |
| 0.0997 | 0.129 |
| 0.0708 | 0.119 |
| 0.0635 | 0.122 |
| 0.0634 | 0.122 |
| 0.0629 | 0.122 |
| 0.062 | 0.121 |
| 0.048 | 0.118 |
| 0.0547 | 0.122 |
| 0.0559 | 0.12 |
| 0.0558 | 0.122 |
| 0.0575 | 0.129 |
| 0.0624 | 0.123 |
| 0.0552 | 0.123 |
| 0.0631 | 0.123 |
| 0.0619 | 0.129 |
| 0.0681 | 0.129 |
| 0.045 | 0.122 |
| 0.0478 | 0.123 |
| 0.0449 | 0.123 |
| 0.0527 | 0.129 |
| 0.0512 | 0.127 |
| 0.0494 | 0.129 |
| 0.0456 | 0.124 |
| 0.017 | 0.102 |
| 0.0148 | 0.104 |
| 0.0211 | 0.104 |
| 0.0234 | 0.106 |
| 0.0212 | 0.107 |
| 0.0178 | 0.114 |
| 0.0177 | 0.114 |
| 0.0155 | 0.106 |
| 0.0186 | 0.105 |
| 0.00835 | 0.114 |
| 0.00793 | 0.109 |
| 0.00178 | 0.115 |
| 0.0105 | 0.112 |
| 0.00145 | 0.115 |
| 0.00382 | 0.106 |
| -0.00107 | 0.109 |
| 0.0262 | 0.114 |
| 0.0278 | 0.11 |
| 0.032 | 0.114 |
| 0.0231 | 0.107 |
| 0.0279 | 0.107 |
| 0.0286 | 0.102 |
| 0.0134 | 0.109 |
| 0.00936 | 0.104 |
| 0.0126 | 0.106 |
| 0.00151 | 0.115 |
| 0.0014 | 0.115 |
| 0.000439 | 0.115 |
| -0.00251 | 0.106 |
| -0.00627 | 0.115 |
| -0.00616 | 0.115 |
| 0.0233 | 0.104 |
| 0.0067 | 0.104 |
| 0.0104 | 0.108 |
| 0.0103 | 0.114 |
| 0.0176 | 0.114 |
| -0.00176 | 0.101 |
| -0.00549 | 0.104 |
| 0.00374 | 0.102 |
| 0.0178 | 0.114 |
| 0.00679 | 0.1 |
| 0.0177 | 0.114 |
| 0.0322 | 0.107 |
| 0.0345 | 0.105 |
| 0.0324 | 0.109 |
| 0.0345 | 0.108 |
| 0.0397 | 0.11 |
| 0.0339 | 0.113 |
| 0.0385 | 0.107 |
| 0.0427 | 0.112 |
| 0.041 | 0.11 |
| 0.0403 | 0.111 |
| 0.0341 | 0.114 |
| 0.0353 | 0.117 |
| 0.0398 | 0.114 |
| 0.0379 | 0.12 |
| 0.0437 | 0.117 |
| 0.0359 | 0.121 |
| 0.0303 | 0.122 |
| 0.032 | 0.117 |
| 0.0277 | 0.119 |
| 0.0231 | 0.117 |
| 0.044 | 0.123 |
| 0.0376 | 0.125 |
| 0.0246 | 0.122 |
| 0.0211 | 0.122 |
| 0.0446 | 0.123 |
| 0.0368 | 0.129 |
| 0.0399 | 0.129 |
| 0.0447 | 0.124 |
| 0.0339 | 0.126 |
| 0.0219 | 0.124 |
| 0.0267 | 0.129 |
| 0.0279 | 0.127 |
| 0.0284 | 0.129 |
| 0.0455 | 0.129 |
| 0.018 | 0.129 |
| 0.0185 | 0.128 |
| 0.0202 | 0.129 |
| 0.00721 | 0.121 |
| 0.00636 | 0.12 |
| 0.0064 | 0.121 |
| 0.00143 | 0.116 |
| 0.00195 | 0.116 |
| 0.0132 | 0.12 |
| 0.0107 | 0.122 |
| -0.00087 | 0.123 |
| -0.00187 | 0.12 |
| 0.00494 | 0.122 |
| 0.0178 | 0.114 |
| 0.0163 | 0.122 |
| 0.0144 | 0.122 |
| 0.0177 | 0.114 |
| 0.0135 | 0.123 |
| 0.0177 | 0.129 |
| 0.0171 | 0.129 |
| -0.0027 | 0.126 |
| 0.00106 | 0.126 |
| -0.000234 | 0.129 |
| -0.00586 | 0.129 |
| 0.00513 | 0.124 |
| 0.00717 | 0.122 |
| 0.0107 | 0.129 |
| 0.00469 | 0.129 |
| 0.00243 | 0.129 |
| -0.0945 | 0.08 |
| -0.0971 | 0.081 |
| -0.0974 | 0.079 |
| -0.0951 | 0.084 |
| -0.104 | 0.072 |
| -0.101 | 0.076 |
| -0.0981 | 0.071 |
| -0.0825 | 0.081 |
| -0.0805 | 0.08 |
| -0.0786 | 0.084 |
| -0.0819 | 0.076 |
| -0.0782 | 0.079 |
| -0.0722 | 0.077 |
| -0.0742 | 0.087 |
| -0.0752 | 0.091 |
| -0.0834 | 0.088 |
| -0.0838 | 0.092 |
| -0.0846 | 0.091 |
| -0.0913 | 0.075 |
| -0.0876 | 0.076 |
| -0.0908 | 0.074 |
| -0.0911 | 0.076 |
| -0.0891 | 0.083 |
| -0.0855 | 0.091 |
| -0.0942 | 0.072 |
| -0.0912 | 0.072 |
| -0.0918 | 0.088 |
| -0.0947 | 0.089 |
| -0.0979 | 0.087 |
| -0.093 | 0.076 |
| -0.104 | 0.079 |
| -0.1 | 0.081 |
| -0.102 | 0.084 |
| -0.104 | 0.082 |
| -0.0696 | 0.085 |
| -0.0705 | 0.091 |
| -0.0651 | 0.09 |
| -0.0634 | 0.081 |
| -0.0673 | 0.077 |
| -0.0533 | 0.074 |
| -0.0553 | 0.082 |
| -0.0551 | 0.075 |
| -0.0538 | 0.074 |
| -0.0552 | 0.074 |
| -0.0619 | 0.077 |
| -0.0565 | 0.087 |
| -0.0563 | 0.086 |
| -0.0502 | 0.085 |
| -0.0561 | 0.087 |
| -0.0462 | 0.083 |
| -0.0455 | 0.081 |
| -0.0434 | 0.072 |
| -0.0463 | 0.084 |
| -0.0461 | 0.084 |
| -0.079 | 0.099 |
| -0.0567 | 0.088 |
| -0.0632 | 0.097 |
| -0.0562 | 0.087 |
| -0.0558 | 0.087 |
| -0.0524 | 0.1 |
| -0.0579 | 0.101 |
| -0.0662 | 0.094 |
| -0.046 | 0.084 |
| -0.0461 | 0.094 |
| -0.0673 | 0.101 |
| -0.0701 | 0.1 |
| -0.0718 | 0.097 |
| -0.0614 | 0.101 |
| -0.0789 | 0.1 |
| -0.077 | 0.1 |
| -0.0847 | 0.093 |
| -0.0848 | 0.092 |
| -0.0795 | 0.1 |
| -0.0712 | 0.101 |
| -0.0491 | 0.104 |
| -0.0473 | 0.102 |
| -0.0469 | 0.105 |
| -0.0956 | 0.095 |
| -0.0902 | 0.098 |
| -0.0923 | 0.092 |
| -0.0957 | 0.101 |
| -0.098 | 0.1 |
| -0.0979 | 0.102 |
| -0.0904 | 0.103 |
| -0.0879 | 0.099 |
| -0.086 | 0.092 |
| -0.102 | 0.092 |
| -0.0981 | 0.092 |
| -0.103 | 0.09 |
| -0.104 | 0.091 |
| -0.098 | 0.096 |
| -0.104 | 0.087 |
| -0.1 | 0.097 |
| -0.104 | 0.093 |
| -0.104 | 0.099 |
| -0.0993 | 0.102 |
| -0.0282 | 0.083 |
| -0.0331 | 0.083 |
| -0.0324 | 0.089 |
| -0.0294 | 0.088 |
| -0.031 | 0.08 |
| -0.0457 | 0.084 |
| -0.0422 | 0.073 |
| -0.0458 | 0.083 |
| -0.038 | 0.078 |
| -0.0382 | 0.082 |
| -0.0375 | 0.087 |
| -0.0403 | 0.072 |
| -0.0336 | 0.074 |
| -0.0341 | 0.079 |
| -0.0316 | 0.076 |
| -0.0276 | 0.071 |
| -0.0319 | 0.072 |
| -0.0252 | 0.073 |
| -0.0276 | 0.078 |
| -0.0254 | 0.085 |
| -0.0249 | 0.079 |
| -0.025 | 0.077 |
| -0.019 | 0.075 |
| -0.0228 | 0.077 |
| -0.0215 | 0.082 |
| -0.019 | 0.08 |
| -0.019 | 0.084 |
| -0.0183 | 0.097 |
| -0.022 | 0.098 |
| -0.021 | 0.1 |
| -0.0262 | 0.096 |
| -0.03 | 0.101 |
| -0.0298 | 0.096 |
| -0.0264 | 0.104 |
| -0.0242 | 0.103 |
| -0.0239 | 0.104 |
| -0.0307 | 0.09 |
| -0.00725 | 0.097 |
| -0.0104 | 0.1 |
| -0.0314 | 0.091 |
| -0.0293 | 0.091 |
| -0.0152 | 0.102 |
| -0.0212 | 0.093 |
| -0.0244 | 0.093 |
| -0.00885 | 0.097 |
| -0.014 | 0.102 |
| -0.0161 | 0.096 |
| -0.0254 | 0.087 |
| -0.0174 | 0.094 |
| -0.00952 | 0.092 |
| -0.0106 | 0.092 |
| -0.011 | 0.092 |
| -0.0126 | 0.093 |
| -0.0223 | 0.089 |
| -0.019 | 0.091 |
| -0.0169 | 0.091 |
| -0.0227 | 0.086 |
| -0.019 | 0.087 |
| -0.0421 | 0.091 |
| -0.0405 | 0.101 |
| -0.0432 | 0.095 |
| -0.0361 | 0.093 |
| -0.0366 | 0.096 |
| -0.032 | 0.103 |
| -0.0334 | 0.099 |
| -0.0365 | 0.102 |
| -0.035 | 0.095 |
| -0.0249 | 0.105 |
| -0.0254 | 0.112 |
| -0.0257 | 0.111 |
| -0.0432 | 0.115 |
| -0.0455 | 0.114 |
| -0.0433 | 0.114 |
| -0.0422 | 0.115 |
| -0.0415 | 0.111 |
| -0.0455 | 0.11 |
| -0.0305 | 0.104 |
| -0.0238 | 0.105 |
| -0.0575 | 0.11 |
| -0.0538 | 0.102 |
| -0.0486 | 0.106 |
| -0.0477 | 0.106 |
| -0.0579 | 0.111 |
| -0.0385 | 0.107 |
| -0.04 | 0.106 |
| -0.0325 | 0.107 |
| -0.0382 | 0.109 |
| -0.0394 | 0.108 |
| -0.0404 | 0.108 |
| -0.0297 | 0.116 |
| -0.0257 | 0.112 |
| -0.0301 | 0.113 |
| -0.0324 | 0.114 |
| -0.0507 | 0.114 |
| -0.0491 | 0.113 |
| -0.0253 | 0.112 |
| -0.0253 | 0.112 |
| -0.0271 | 0.121 |
| -0.0277 | 0.121 |
| -0.0218 | 0.12 |
| -0.0186 | 0.118 |
| -0.0226 | 0.114 |
| -0.0182 | 0.118 |
| -0.0338 | 0.111 |
| -0.0574 | 0.113 |
| -0.058 | 0.111 |
| -0.0511 | 0.115 |
| -0.0514 | 0.117 |
| -0.057 | 0.121 |
| -0.0333 | 0.118 |
| -0.0358 | 0.113 |
| -0.0371 | 0.119 |
| -0.0498 | 0.115 |
| -0.0169 | 0.112 |
| -0.0218 | 0.107 |
| -0.0248 | 0.112 |
| -0.0159 | 0.11 |
| -0.0102 | 0.109 |
| -0.0107 | 0.11 |
| -0.0108 | 0.11 |
| -0.00635 | 0.114 |
| -0.017 | 0.103 |
| -0.0103 | 0.11 |
| -0.00719 | 0.115 |
| -0.013 | 0.103 |
| -0.014 | 0.103 |
| -0.0144 | 0.112 |
| -0.012 | 0.117 |
| -0.0178 | 0.118 |
| -0.0136 | 0.102 |
| -0.0132 | 0.121 |
| -0.018 | 0.118 |
| -0.00973 | 0.121 |
| -0.0155 | 0.129 |
| -0.0154 | 0.129 |
| -0.0152 | 0.129 |
| -0.0151 | 0.129 |
| -0.0274 | 0.122 |
| -0.00677 | 0.116 |
| -0.00479 | 0.122 |
| -0.0183 | 0.118 |
| -0.0267 | 0.122 |
| -0.00682 | 0.125 |
| -0.0158 | 0.129 |
| -0.0186 | 0.119 |
| -0.0226 | 0.127 |
| -0.0271 | 0.122 |
| -0.0244 | 0.129 |
| -0.0282 | 0.123 |
| -0.0297 | 0.129 |
| -0.0336 | 0.129 |
| -0.0438 | 0.116 |
| -0.0536 | 0.121 |
| -0.0426 | 0.115 |
| -0.0351 | 0.121 |
| -0.0492 | 0.116 |
| -0.0466 | 0.122 |
| -0.0506 | 0.122 |
| -0.0377 | 0.122 |
| -0.0412 | 0.122 |
| -0.0536 | 0.125 |
| -0.0532 | 0.129 |
| -0.0514 | 0.127 |
| -0.0351 | 0.126 |
| -0.0386 | 0.129 |
| -0.0422 | 0.128 |
| -0.0443 | 0.126 |
| -0.0477 | 0.129 |
| -0.0431 | 0.129 |
| -0.0914 | 0.106 |
| -0.0973 | 0.103 |
| -0.0849 | 0.106 |
| -0.0884 | 0.107 |
| -0.0782 | 0.108 |
| -0.0777 | 0.108 |
| -0.0772 | 0.108 |
| -0.0779 | 0.109 |
| -0.0832 | 0.117 |
| -0.0829 | 0.117 |
| -0.0831 | 0.117 |
| -0.0787 | 0.103 |
| -0.0799 | 0.108 |
| -0.091 | 0.109 |
| -0.0891 | 0.113 |
| -0.0855 | 0.109 |
| -0.082 | 0.115 |
| -0.0743 | 0.115 |
| -0.0738 | 0.116 |
| -0.0737 | 0.116 |
| -0.091 | 0.115 |
| -0.0911 | 0.113 |
| -0.093 | 0.113 |
| -0.0978 | 0.104 |
| -0.0932 | 0.107 |
| -0.0959 | 0.116 |
| -0.0981 | 0.115 |
| -0.0982 | 0.117 |
| -0.0975 | 0.11 |
| -0.0998 | 0.116 |
| -0.104 | 0.108 |
| -0.104 | 0.107 |
| -0.104 | 0.114 |
| -0.0986 | 0.103 |
| -0.104 | 0.107 |
| -0.104 | 0.107 |
| -0.0722 | 0.114 |
| -0.0674 | 0.11 |
| -0.0677 | 0.109 |
| -0.0703 | 0.102 |
| -0.0588 | 0.12 |
| -0.0587 | 0.111 |
| -0.0609 | 0.119 |
| -0.0585 | 0.111 |
| -0.0624 | 0.103 |
| -0.067 | 0.108 |
| -0.0637 | 0.11 |
| -0.0674 | 0.109 |
| -0.064 | 0.115 |
| -0.0734 | 0.116 |
| -0.0583 | 0.129 |
| -0.061 | 0.125 |
| -0.0744 | 0.129 |
| -0.0769 | 0.125 |
| -0.0735 | 0.127 |
| -0.0722 | 0.129 |
| -0.0687 | 0.122 |
| -0.0686 | 0.122 |
| -0.0738 | 0.116 |
| -0.078 | 0.122 |
| -0.0686 | 0.122 |
| -0.0828 | 0.117 |
| -0.083 | 0.117 |
| -0.0795 | 0.123 |
| -0.0601 | 0.121 |
| -0.0686 | 0.122 |
| -0.0687 | 0.122 |
| -0.0686 | 0.122 |
| -0.0819 | 0.128 |
| -0.0827 | 0.128 |
| -0.0805 | 0.129 |
| -0.0824 | 0.129 |
| -0.0685 | 0.122 |
| -0.0626 | 0.129 |
| -0.0653 | 0.129 |
| -0.0836 | 0.117 |
| -0.0907 | 0.119 |
| -0.09 | 0.123 |
| -0.0862 | 0.123 |
| -0.0932 | 0.123 |
| -0.098 | 0.118 |
| -0.0902 | 0.126 |
| -0.0848 | 0.127 |
| -0.0832 | 0.129 |
| -0.104 | 0.121 |
| -0.104 | 0.122 |
| -0.0971 | 0.123 |
| -0.0965 | 0.127 |
| -0.0934 | 0.129 |
| -0.089 | 0.129 |
| -0.104 | 0.122 |
| -0.104 | 0.122 |
| -0.0986 | 0.129 |
| -0.096 | 0.129 |
| -0.104 | 0.129 |